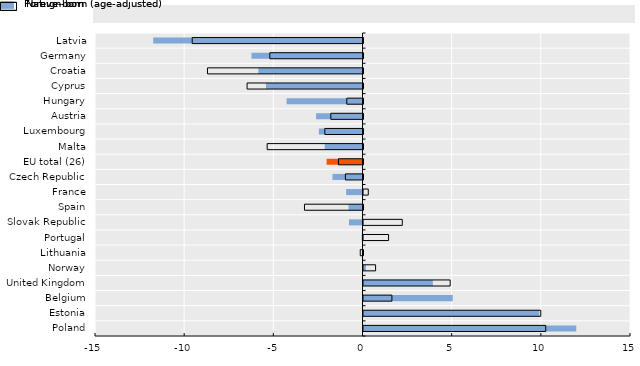
| Category | Foreign-born (age-adjusted) | Native-born |
|---|---|---|
| Poland | 11.931 | 10.219 |
| Estonia | 9.86 | 9.941 |
| Belgium | 5.005 | 1.593 |
| United Kingdom | 3.888 | 4.86 |
| Norway | 0.136 | 0.679 |
| Lithuania | -0.012 | -0.154 |
| Portugal | -0.05 | 1.405 |
| Slovak Republic | -0.758 | 2.175 |
| Spain | -0.781 | -3.281 |
| France | -0.919 | 0.268 |
| Czech Republic | -1.686 | -0.988 |
| EU total (26) | -2.013 | -1.376 |
| Malta | -2.12 | -5.374 |
| Luxembourg | -2.448 | -2.141 |
| Austria | -2.604 | -1.805 |
| Hungary | -4.257 | -0.909 |
| Cyprus | -5.413 | -6.5 |
| Croatia | -5.839 | -8.721 |
| Germany | -6.228 | -5.224 |
| Latvia | -11.735 | -9.578 |